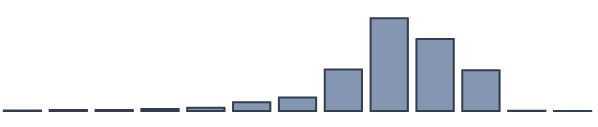
| Category | Series 0 |
|---|---|
| 0 | 0.217 |
| 1 | 0.391 |
| 2 | 0.391 |
| 3 | 0.739 |
| 4 | 1.13 |
| 5 | 3.13 |
| 6 | 4.87 |
| 7 | 14.957 |
| 8 | 33.391 |
| 9 | 25.957 |
| 10 | 14.696 |
| 11 | 0.087 |
| 12 | 0.043 |